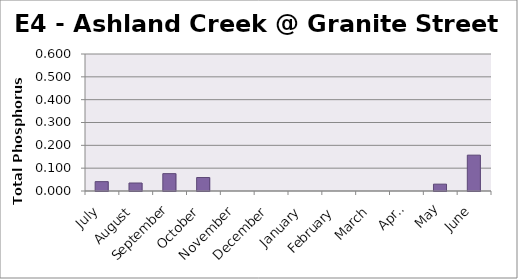
| Category | Phosphorus (mg/L) |
|---|---|
| July | 0.041 |
| August | 0.035 |
| September | 0.076 |
| October | 0.059 |
| November | 0 |
| December | 0 |
| January | 0 |
| February | 0 |
| March | 0 |
| April | 0 |
| May | 0.03 |
| June | 0.157 |